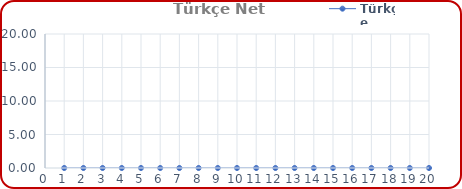
| Category | Türkçe |
|---|---|
| 0 | 0 |
| 1 | 0 |
| 2 | 0 |
| 3 | 0 |
| 4 | 0 |
| 5 | 0 |
| 6 | 0 |
| 7 | 0 |
| 8 | 0 |
| 9 | 0 |
| 10 | 0 |
| 11 | 0 |
| 12 | 0 |
| 13 | 0 |
| 14 | 0 |
| 15 | 0 |
| 16 | 0 |
| 17 | 0 |
| 18 | 0 |
| 19 | 0 |